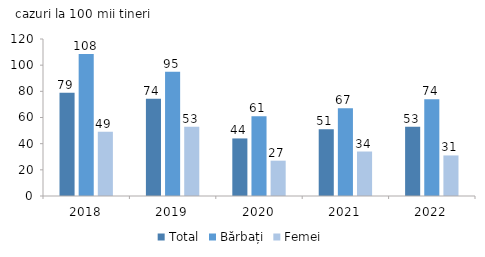
| Category | Total | Bărbați | Femei |
|---|---|---|---|
| 2018.0 | 78.949 | 108.443 | 49.115 |
| 2019.0 | 74.336 | 95 | 53 |
| 2020.0 | 44 | 61 | 27 |
| 2021.0 | 51 | 67 | 34 |
| 2022.0 | 53 | 74 | 31 |